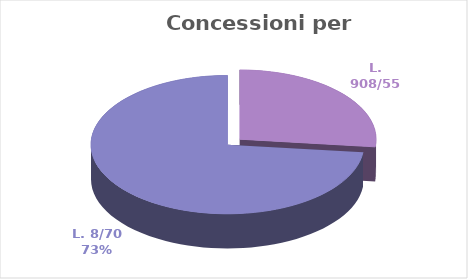
| Category | Series 0 |
|---|---|
| L. 908/55 | 3571500 |
| L. 8/70 | 9768000 |